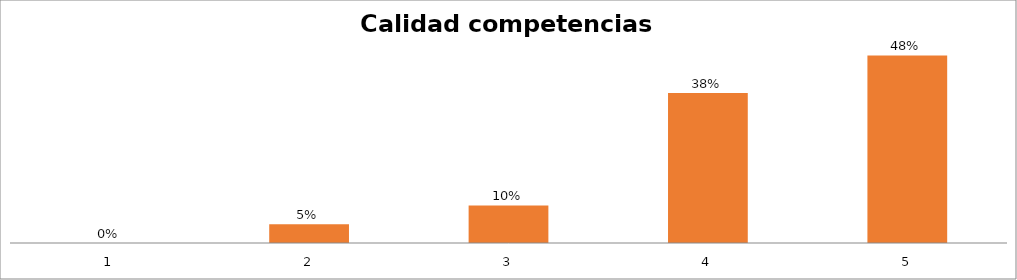
| Category | Series 1 |
|---|---|
| 0 | 0 |
| 1 | 0.048 |
| 2 | 0.095 |
| 3 | 0.381 |
| 4 | 0.476 |